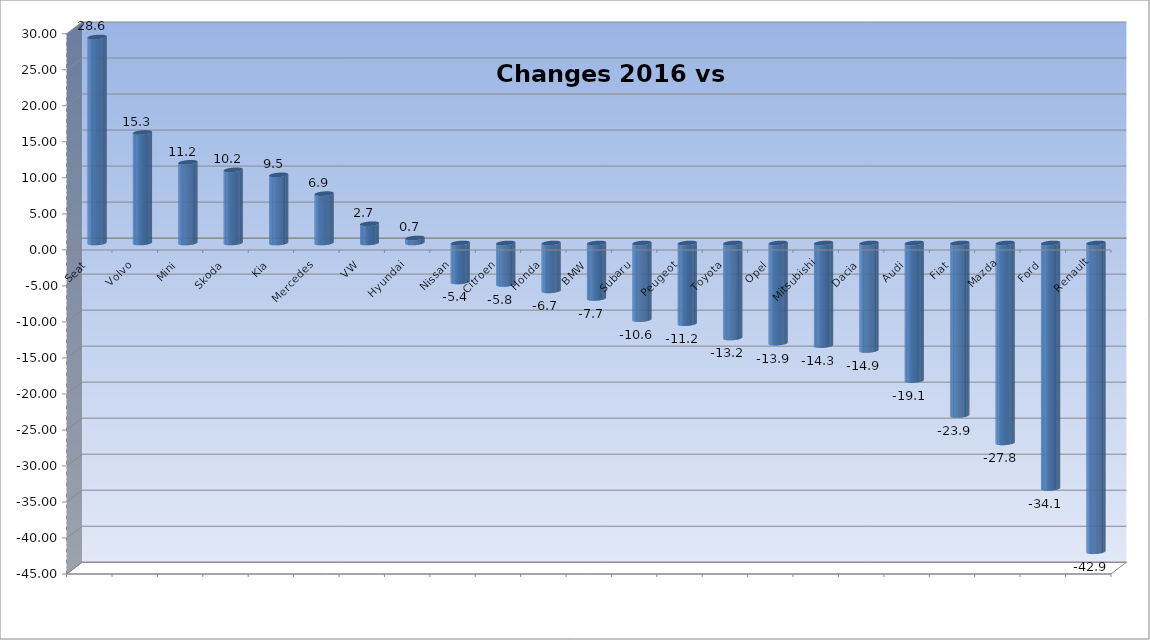
| Category | Ytd 2015 |
|---|---|
| Seat | 28.599 |
| Volvo | 15.346 |
| Mini | 11.203 |
| Skoda | 10.157 |
| Kia | 9.455 |
| Mercedes | 6.853 |
| VW | 2.673 |
| Hyundai | 0.696 |
| Nissan | -5.409 |
| Citroen | -5.754 |
| Honda | -6.65 |
| BMW | -7.699 |
| Subaru | -10.638 |
| Peugeot | -11.206 |
| Toyota | -13.19 |
| Opel | -13.905 |
| Mitsubishi | -14.253 |
| Dacia | -14.921 |
| Audi | -19.104 |
| Fiat | -23.947 |
| Mazda | -27.753 |
| Ford | -34.075 |
| Renault | -42.866 |